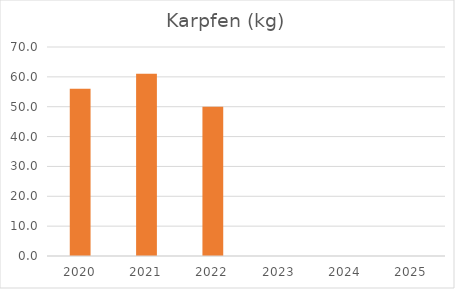
| Category | Karpfen (kg) |
|---|---|
| 2020.0 | 56 |
| 2021.0 | 61 |
| 2022.0 | 50 |
| 2023.0 | 0 |
| 2024.0 | 0 |
| 2025.0 | 0 |